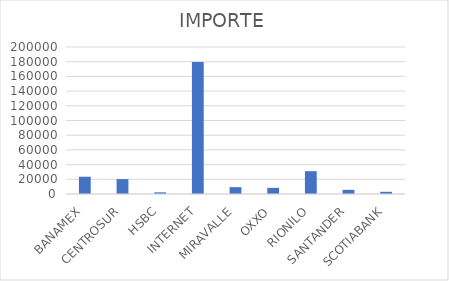
| Category | IMPORTE |
|---|---|
| BANAMEX | 23486.39 |
| CENTROSUR | 20211 |
| HSBC | 2250.27 |
| INTERNET | 179428.02 |
| MIRAVALLE | 9313 |
| OXXO | 8351.71 |
| RIONILO | 31053 |
| SANTANDER | 5621.59 |
| SCOTIABANK | 2955.76 |